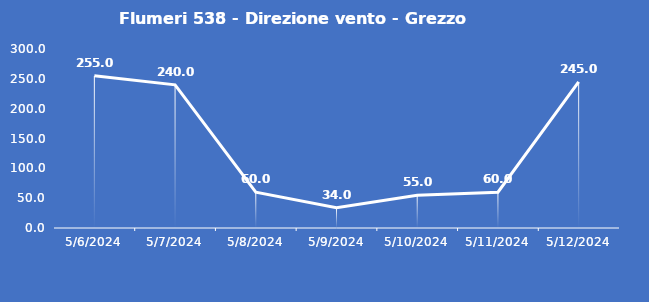
| Category | Flumeri 538 - Direzione vento - Grezzo (°N) |
|---|---|
| 5/6/24 | 255 |
| 5/7/24 | 240 |
| 5/8/24 | 60 |
| 5/9/24 | 34 |
| 5/10/24 | 55 |
| 5/11/24 | 60 |
| 5/12/24 | 245 |